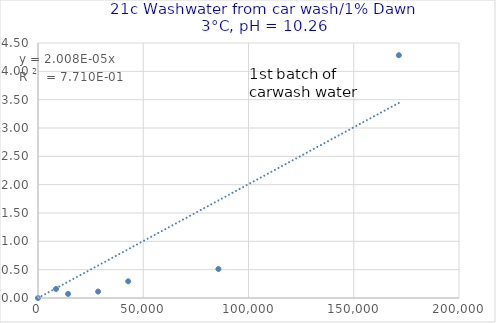
| Category | Series 0 |
|---|---|
| 0.0 | 0 |
| 8571.428571428572 | 0.16 |
| 14285.714285714286 | 0.073 |
| 28571.428571428572 | 0.114 |
| 42857.14285714286 | 0.294 |
| 85714.28571428572 | 0.512 |
| 171428.57142857145 | 4.285 |